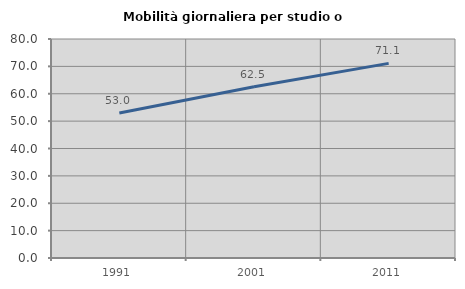
| Category | Mobilità giornaliera per studio o lavoro |
|---|---|
| 1991.0 | 52.989 |
| 2001.0 | 62.531 |
| 2011.0 | 71.096 |